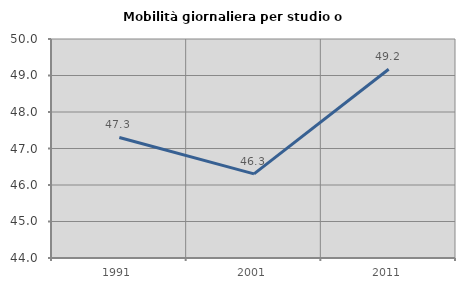
| Category | Mobilità giornaliera per studio o lavoro |
|---|---|
| 1991.0 | 47.302 |
| 2001.0 | 46.304 |
| 2011.0 | 49.17 |